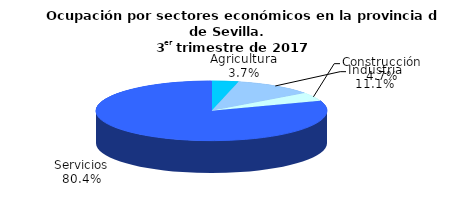
| Category | Series 0 |
|---|---|
| Agricultura | 26.4 |
| Industria | 78.4 |
| Construcción | 33 |
| Servicios | 566.9 |